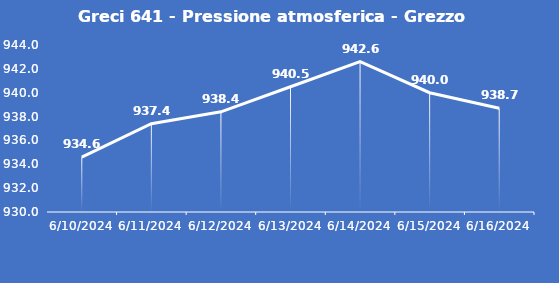
| Category | Greci 641 - Pressione atmosferica - Grezzo (hPa) |
|---|---|
| 6/10/24 | 934.6 |
| 6/11/24 | 937.4 |
| 6/12/24 | 938.4 |
| 6/13/24 | 940.5 |
| 6/14/24 | 942.6 |
| 6/15/24 | 940 |
| 6/16/24 | 938.7 |